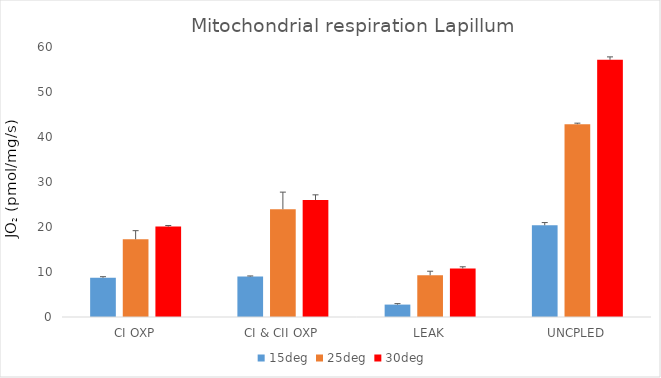
| Category | 15deg | 25deg | 30deg |
|---|---|---|---|
| CI OXP | 8.725 | 17.266 | 20.088 |
| CI & CII OXP | 8.985 | 23.943 | 25.995 |
| LEAK | 2.757 | 9.266 | 10.781 |
| UNCPLED | 20.37 | 42.851 | 57.15 |